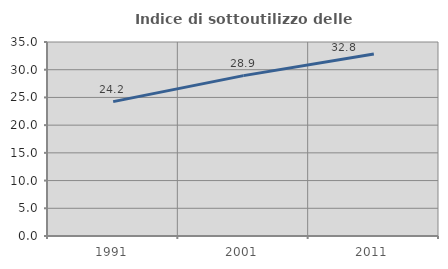
| Category | Indice di sottoutilizzo delle abitazioni  |
|---|---|
| 1991.0 | 24.242 |
| 2001.0 | 28.934 |
| 2011.0 | 32.831 |